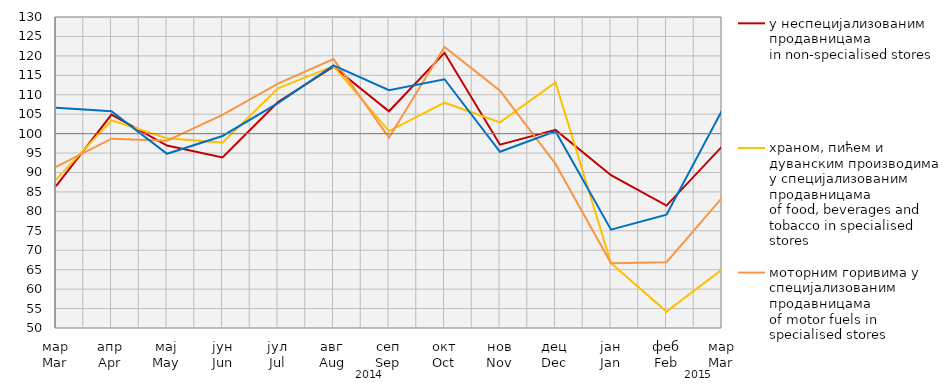
| Category | у неспецијализованим продавницама
in non-specialised stores | храном, пићем и дуванским производима у специјализовaним продавницама
of food, beverages and tobacco in specialised stores | моторним горивима у специјализованим продавницама
of motor fuels in specialised stores | остала
other |
|---|---|---|---|---|
| мар
Mar | 86.512 | 88.17 | 91.443 | 106.636 |
| апр
Apr | 104.885 | 103.415 | 98.688 | 105.773 |
| мај
May | 96.934 | 98.808 | 98.199 | 94.819 |
| јун
Jun | 93.89 | 97.692 | 104.846 | 99.399 |
| јул
Jul | 108.135 | 111.647 | 112.88 | 107.832 |
| авг
Aug | 117.197 | 117.35 | 119.168 | 117.561 |
| сеп
Sep | 105.746 | 100.667 | 98.985 | 111.158 |
| окт
Oct | 120.794 | 107.958 | 122.269 | 113.987 |
| нов
Nov | 97.159 | 102.886 | 111.05 | 95.325 |
| дец
Dec | 100.966 | 113.178 | 92.21 | 100.587 |
| јан
Jan | 89.292 | 66.659 | 66.673 | 75.303 |
| феб
Feb | 81.481 | 54.212 | 66.916 | 79.165 |
| мар
Mar | 96.668 | 65.042 | 83.485 | 105.918 |